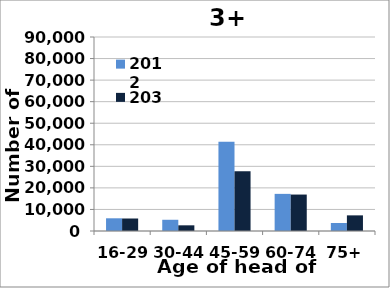
| Category | 2012 | 2037 |
|---|---|---|
| 16-29 | 5894 | 5799 |
| 30-44 | 5208 | 2633 |
| 45-59 | 41453 | 27759 |
| 60-74 | 17225 | 16910 |
| 75+ | 3717 | 7254 |